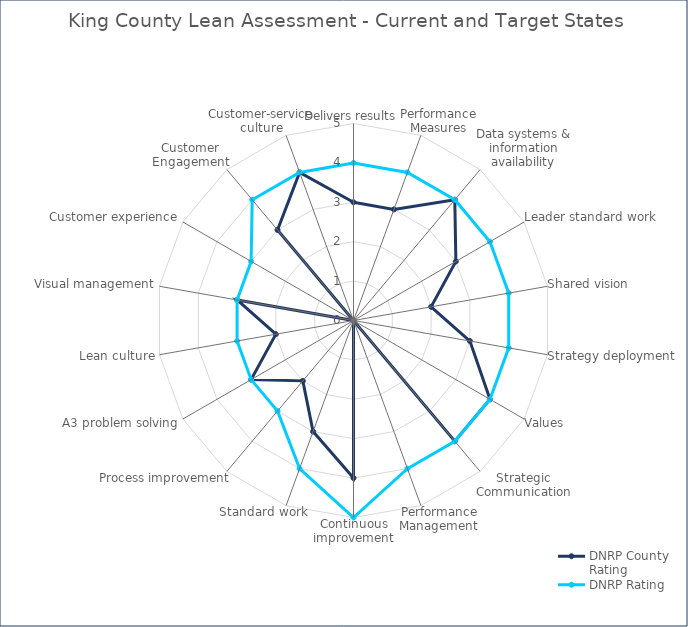
| Category | DNRP County Rating | DNRP Rating |
|---|---|---|
| Delivers results | 3 | 4 |
| Performance Measures | 3 | 4 |
| Data systems & information availability | 4 | 4 |
| Leader standard work | 3 | 4 |
| Shared vision | 2 | 4 |
| Strategy deployment | 3 | 4 |
| Values | 4 | 4 |
| Strategic Communication | 4 | 4 |
| Performance Management | 0 | 4 |
| Continuous improvement | 4 | 5 |
| Standard work | 3 | 4 |
| Process improvement | 2 | 3 |
| A3 problem solving | 3 | 3 |
| Lean culture | 2 | 3 |
| Visual management | 3 | 3 |
| Customer experience | 0 | 3 |
| Customer Engagement | 3 | 4 |
| Customer-service culture | 4 | 4 |